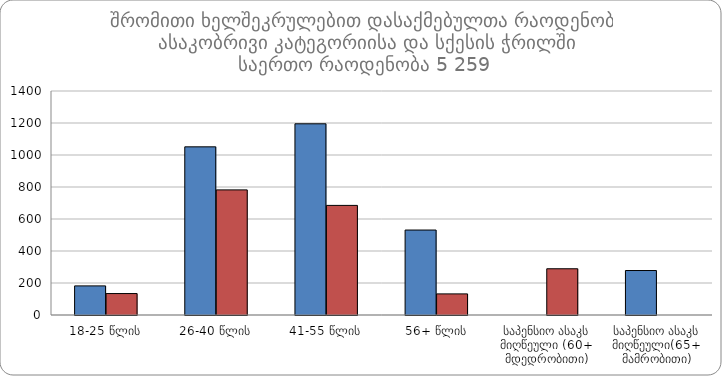
| Category |  მამრობითი |  მდედრობითი |
|---|---|---|
| 18-25 წლის | 182 | 134 |
| 26-40 წლის | 1051 | 782 |
| 41-55 წლის | 1195 | 685 |
| 56+ წლის | 531 | 132 |
| საპენსიო ასაკს მიღწეული (60+ მდედრობითი) | 0 | 289 |
| საპენსიო ასაკს მიღწეული(65+ მამრობითი) | 278 | 0 |